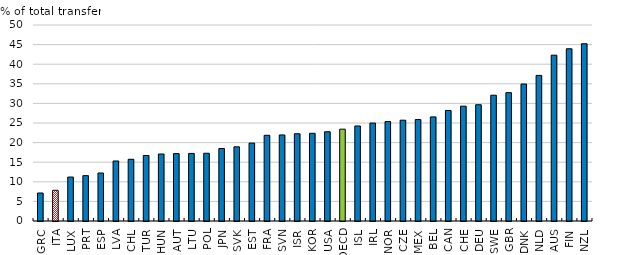
| Category | Poorest 20% |
|---|---|
| GRC | 7.14 |
| ITA | 7.831 |
| LUX | 11.21 |
| PRT | 11.565 |
| ESP | 12.245 |
| LVA | 15.307 |
| CHL | 15.743 |
| TUR | 16.716 |
| HUN | 17.094 |
| AUT | 17.192 |
| LTU | 17.239 |
| POL | 17.285 |
| JPN | 18.496 |
| SVK | 18.924 |
| EST | 19.877 |
| FRA | 21.86 |
| SVN | 21.949 |
| ISR | 22.262 |
| KOR | 22.37 |
| USA | 22.763 |
| OECD | 23.425 |
| ISL | 24.235 |
| IRL | 24.983 |
| NOR | 25.371 |
| CZE | 25.714 |
| MEX | 25.878 |
| BEL | 26.552 |
| CAN | 28.194 |
| CHE | 29.289 |
| DEU | 29.658 |
| SWE | 32.086 |
| GBR | 32.744 |
| DNK | 34.935 |
| NLD | 37.143 |
| AUS | 42.3 |
| FIN | 43.935 |
| NZL | 45.22 |